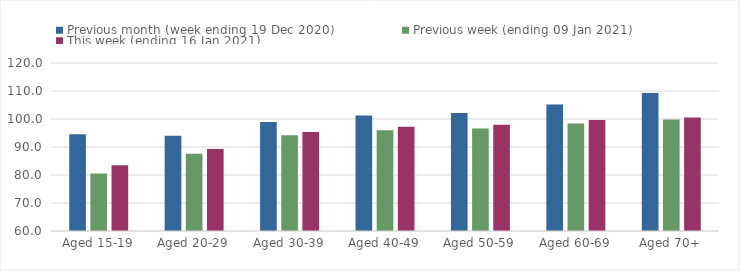
| Category | Previous month (week ending 19 Dec 2020) | Previous week (ending 09 Jan 2021) | This week (ending 16 Jan 2021) |
|---|---|---|---|
| Aged 15-19 | 94.55 | 80.53 | 83.48 |
| Aged 20-29 | 94.05 | 87.59 | 89.3 |
| Aged 30-39 | 98.95 | 94.19 | 95.4 |
| Aged 40-49 | 101.26 | 95.95 | 97.27 |
| Aged 50-59 | 102.16 | 96.6 | 97.98 |
| Aged 60-69 | 105.18 | 98.42 | 99.6 |
| Aged 70+ | 109.27 | 99.83 | 100.58 |